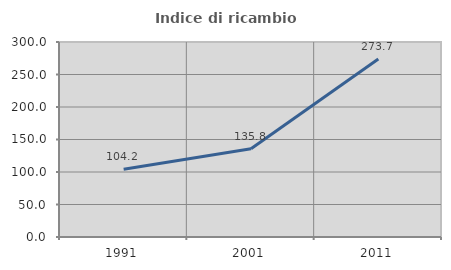
| Category | Indice di ricambio occupazionale  |
|---|---|
| 1991.0 | 104.177 |
| 2001.0 | 135.797 |
| 2011.0 | 273.742 |